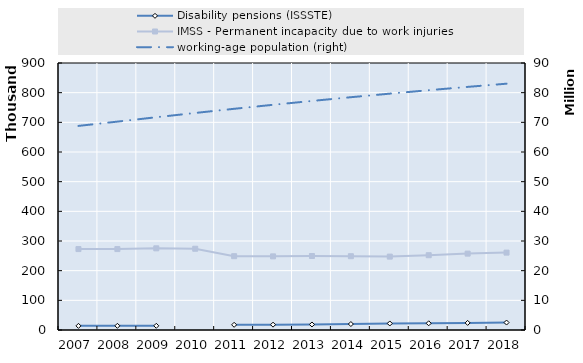
| Category | Disability pensions (ISSSTE) | IMSS - Permanent incapacity due to work injuries |
|---|---|---|
| 2007.0 | 13933 | 272818 |
| 2008.0 | 14067 | 272742 |
| 2009.0 | 14174 | 275269 |
| 2010.0 | 0 | 273877 |
| 2011.0 | 17490 | 248782 |
| 2012.0 | 17980 | 248175 |
| 2013.0 | 18604 | 249422 |
| 2014.0 | 20083 | 248735 |
| 2015.0 | 22028 | 247353 |
| 2016.0 | 22620 | 252114 |
| 2017.0 | 23945 | 257464 |
| 2018.0 | 25172 | 260844 |